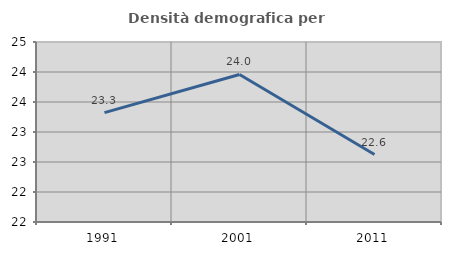
| Category | Densità demografica |
|---|---|
| 1991.0 | 23.324 |
| 2001.0 | 23.959 |
| 2011.0 | 22.625 |